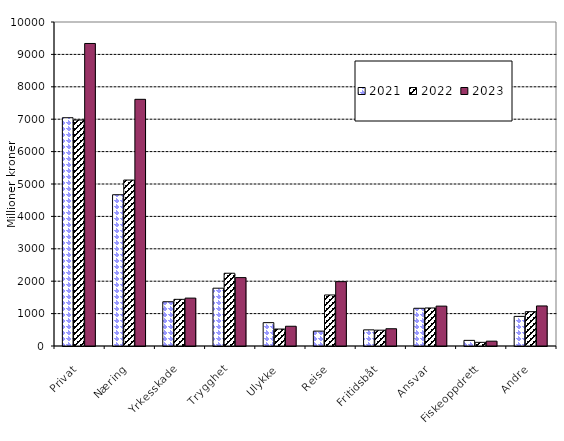
| Category | 2021 | 2022 | 2023 |
|---|---|---|---|
| Privat | 7045.66 | 6974.812 | 9337.281 |
| Næring | 4668.555 | 5121.547 | 7613.48 |
| Yrkesskade | 1366.204 | 1440.024 | 1478.375 |
| Trygghet | 1784.325 | 2245.774 | 2110.853 |
| Ulykke | 720.864 | 523.632 | 609.431 |
| Reise | 459.278 | 1574.599 | 1986.224 |
| Fritidsbåt | 498.321 | 488.151 | 532.416 |
| Ansvar | 1164.283 | 1173.572 | 1231.156 |
| Fiskeoppdrett | 173.799 | 113.031 | 149.217 |
| Andre | 914.046 | 1059.447 | 1236.098 |